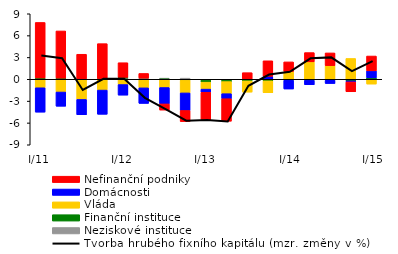
| Category | Neziskové instituce | Finanční instituce | Vláda | Domácnosti | Nefinanční podniky |
|---|---|---|---|---|---|
| I/11 | 0.016 | 0.163 | -1.165 | -3.352 | 7.631 |
| II | 0.004 | 0.156 | -1.75 | -1.955 | 6.479 |
| III | -0.011 | 0.09 | -2.759 | -2.11 | 3.35 |
| IV | -0.001 | 0.097 | -1.482 | -3.326 | 4.799 |
| I/12 | 0.164 | 0.106 | -0.724 | -1.454 | 2.005 |
| II | 0.159 | -0.033 | -1.144 | -2.139 | 0.641 |
| III | 0.156 | -0.009 | -1.124 | -2.253 | -0.844 |
| IV | 0.154 | -0.126 | -1.75 | -2.413 | -1.526 |
| I/13 | -0.109 | -0.284 | -0.96 | -0.433 | -3.772 |
| II | -0.101 | -0.217 | -1.663 | -0.691 | -3.09 |
| III | -0.089 | -0.136 | -1.541 | 0.021 | 0.886 |
|  IV | -0.084 | -0.134 | -1.637 | 0.411 | 2.127 |
|  I/14 | -0.003 | -0.144 | 1.074 | -1.19 | 1.313 |
| II | -0.012 | -0.145 | 2.397 | -0.598 | 1.271 |
| III | -0.009 | -0.133 | 1.875 | -0.441 | 1.746 |
|  IV | -0.017 | -0.201 | 2.86 | -0.147 | -1.355 |
|  I/15 | -0.005 | 0.194 | -0.654 | 0.968 | 2.035 |